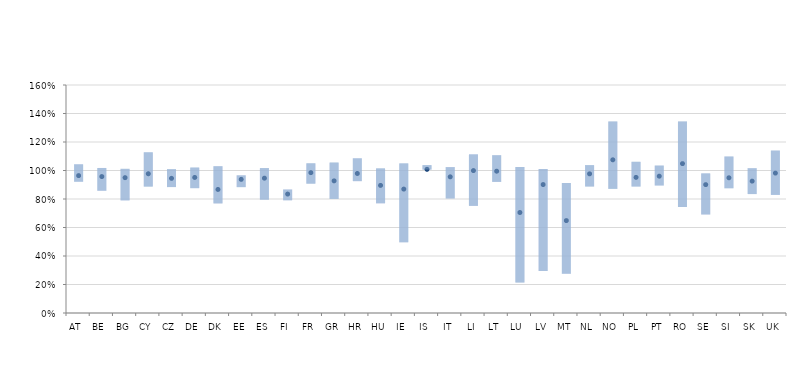
| Category | 25% | 50% | 75% |
|---|---|---|---|
| AT | 0.921 | 0.964 | 1.043 |
| BE | 0.858 | 0.957 | 1.018 |
| BG | 0.79 | 0.95 | 1.012 |
| CY | 0.887 | 0.977 | 1.128 |
| CZ | 0.884 | 0.945 | 1.009 |
| DE | 0.876 | 0.951 | 1.021 |
| DK | 0.769 | 0.867 | 1.03 |
| EE | 0.883 | 0.938 | 0.966 |
| ES | 0.795 | 0.946 | 1.017 |
| FI | 0.791 | 0.835 | 0.866 |
| FR | 0.908 | 0.985 | 1.05 |
| GR | 0.801 | 0.927 | 1.056 |
| HR | 0.925 | 0.979 | 1.086 |
| HU | 0.77 | 0.895 | 1.015 |
| IE | 0.496 | 0.87 | 1.05 |
| IS | 1.006 | 1.008 | 1.038 |
| IT | 0.804 | 0.955 | 1.024 |
| LI | 0.752 | 0.999 | 1.113 |
| LT | 0.92 | 0.995 | 1.107 |
| LU | 0.213 | 0.705 | 1.025 |
| LV | 0.295 | 0.901 | 1.011 |
| MT | 0.275 | 0.649 | 0.912 |
| NL | 0.888 | 0.977 | 1.038 |
| NO | 0.871 | 1.075 | 1.344 |
| PL | 0.887 | 0.952 | 1.061 |
| PT | 0.895 | 0.96 | 1.034 |
| RO | 0.744 | 1.048 | 1.344 |
| SE | 0.692 | 0.901 | 0.98 |
| SI | 0.875 | 0.949 | 1.098 |
| SK | 0.835 | 0.925 | 1.016 |
| UK | 0.829 | 0.982 | 1.14 |